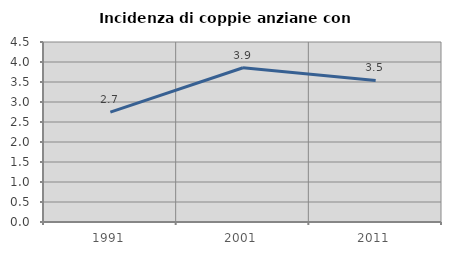
| Category | Incidenza di coppie anziane con figli |
|---|---|
| 1991.0 | 2.746 |
| 2001.0 | 3.856 |
| 2011.0 | 3.539 |